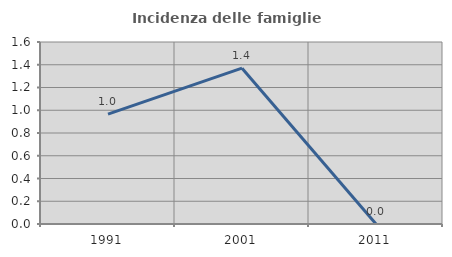
| Category | Incidenza delle famiglie numerose |
|---|---|
| 1991.0 | 0.966 |
| 2001.0 | 1.37 |
| 2011.0 | 0 |